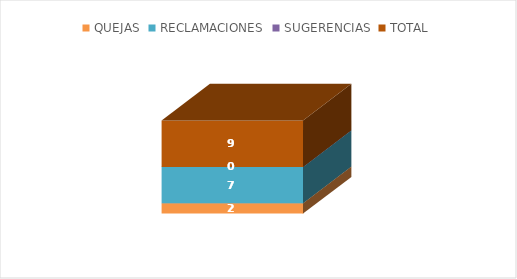
| Category | QUEJAS | RECLAMACIONES | SUGERENCIAS | TOTAL |
|---|---|---|---|---|
| 0 | 2 | 7 | 0 | 9 |